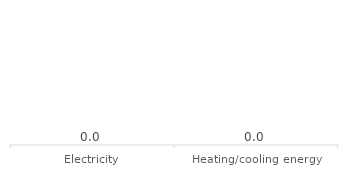
| Category | Series 0 |
|---|---|
| Electricity | 0 |
| Heating/cooling energy | 0 |